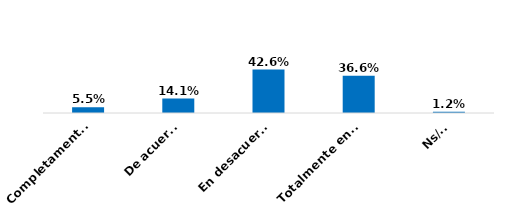
| Category | Series 0 |
|---|---|
| Completamente de acuerdo | 0.055 |
| De acuerdo | 0.141 |
| En desacuerdo | 0.426 |
| Totalmente en desacuerdo | 0.366 |
| Ns/Nr | 0.012 |